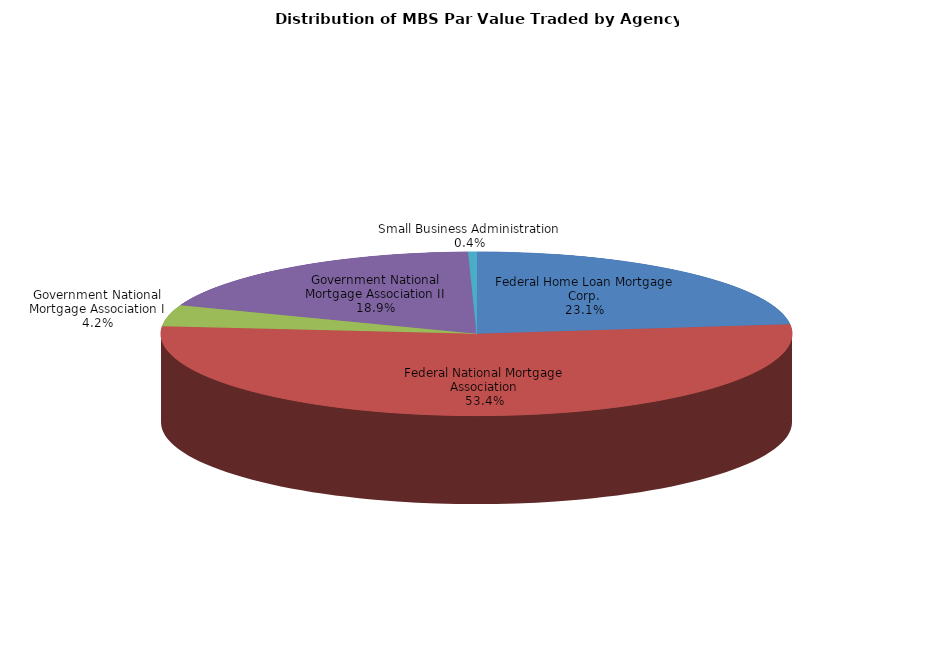
| Category | Series 0 |
|---|---|
| Federal Home Loan Mortgage Corp. | 3365966447.044 |
| Federal National Mortgage Association | 7769624542.126 |
| Government National Mortgage Association I | 607738593.725 |
| Government National Mortgage Association II | 2753817852.962 |
| Small Business Administration | 62366745.547 |